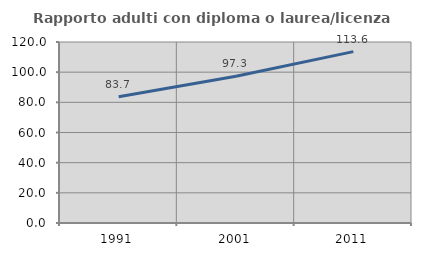
| Category | Rapporto adulti con diploma o laurea/licenza media  |
|---|---|
| 1991.0 | 83.693 |
| 2001.0 | 97.321 |
| 2011.0 | 113.616 |